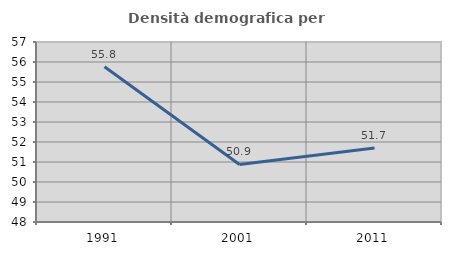
| Category | Densità demografica |
|---|---|
| 1991.0 | 55.764 |
| 2001.0 | 50.877 |
| 2011.0 | 51.706 |